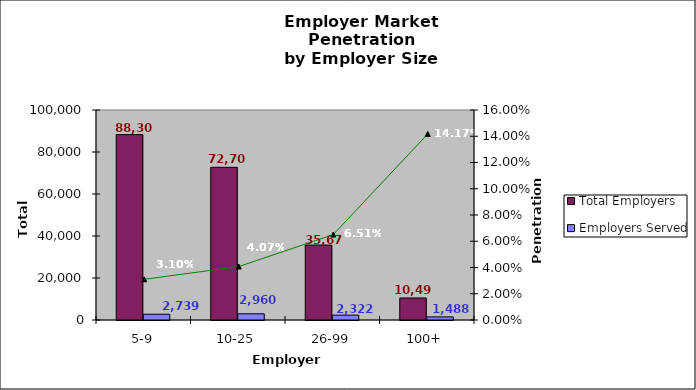
| Category | Total Employers | Employers Served |
|---|---|---|
| 5-9 | 88303 | 2739 |
| 10-25 | 72705 | 2960 |
| 26-99 | 35679 | 2322 |
| 100+ | 10498 | 1488 |